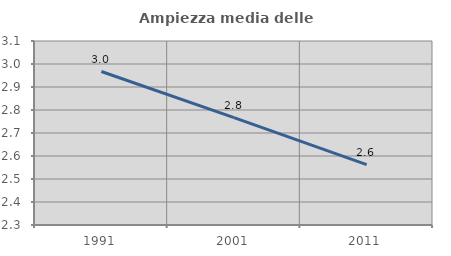
| Category | Ampiezza media delle famiglie |
|---|---|
| 1991.0 | 2.967 |
| 2001.0 | 2.767 |
| 2011.0 | 2.562 |